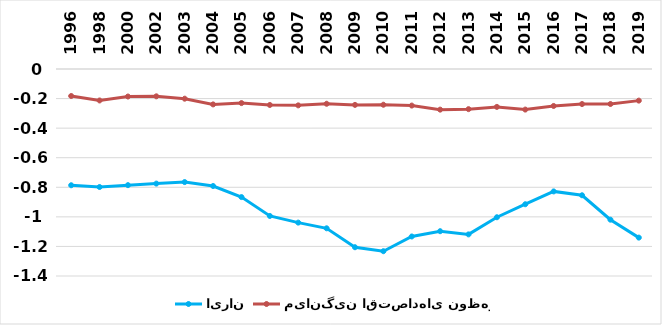
| Category | ایران | میانگین اقتصادهای نوظهور |
|---|---|---|
| 1996.0 | -0.786 | -0.183 |
| 1998.0 | -0.798 | -0.213 |
| 2000.0 | -0.786 | -0.186 |
| 2002.0 | -0.775 | -0.185 |
| 2003.0 | -0.765 | -0.201 |
| 2004.0 | -0.791 | -0.239 |
| 2005.0 | -0.866 | -0.231 |
| 2006.0 | -0.994 | -0.243 |
| 2007.0 | -1.039 | -0.246 |
| 2008.0 | -1.077 | -0.235 |
| 2009.0 | -1.206 | -0.243 |
| 2010.0 | -1.232 | -0.242 |
| 2011.0 | -1.133 | -0.247 |
| 2012.0 | -1.097 | -0.275 |
| 2013.0 | -1.119 | -0.271 |
| 2014.0 | -1.003 | -0.256 |
| 2015.0 | -0.915 | -0.274 |
| 2016.0 | -0.828 | -0.25 |
| 2017.0 | -0.854 | -0.237 |
| 2018.0 | -1.019 | -0.237 |
| 2019.0 | -1.14 | -0.214 |